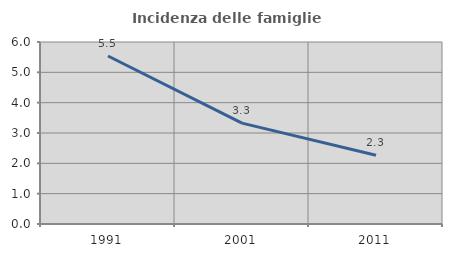
| Category | Incidenza delle famiglie numerose |
|---|---|
| 1991.0 | 5.54 |
| 2001.0 | 3.326 |
| 2011.0 | 2.267 |